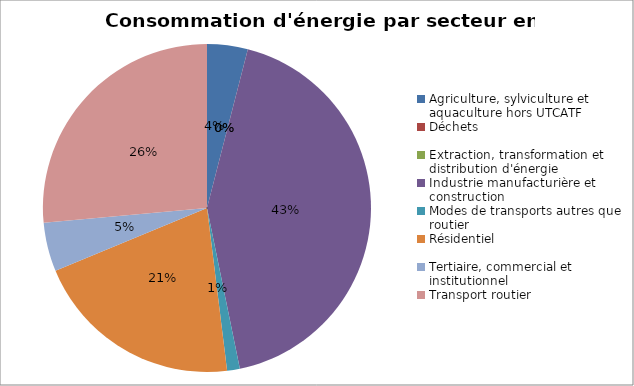
| Category | Series 0 |
|---|---|
| Agriculture, sylviculture et aquaculture hors UTCATF | 50037.453 |
| Déchets | 0 |
| Extraction, transformation et distribution d'énergie | 0 |
| Industrie manufacturière et construction | 534083.142 |
| Modes de transports autres que routier | 15685.193 |
| Résidentiel | 258518.64 |
| Tertiaire, commercial et institutionnel | 60149.718 |
| Transport routier | 330008.921 |